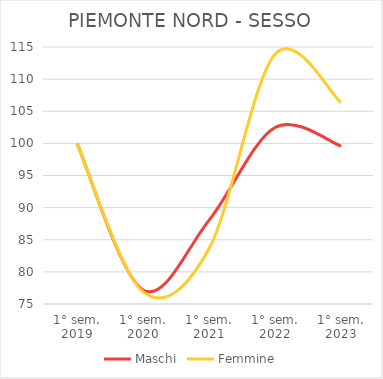
| Category | Maschi | Femmine |
|---|---|---|
| 1° sem.
2019 | 100 | 100 |
| 1° sem.
2020 | 77.175 | 76.918 |
| 1° sem.
2021 | 88.024 | 83.609 |
| 1° sem.
2022 | 102.466 | 113.89 |
| 1° sem.
2023 | 99.577 | 106.353 |